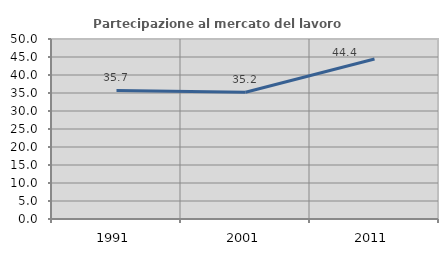
| Category | Partecipazione al mercato del lavoro  femminile |
|---|---|
| 1991.0 | 35.714 |
| 2001.0 | 35.211 |
| 2011.0 | 44.444 |